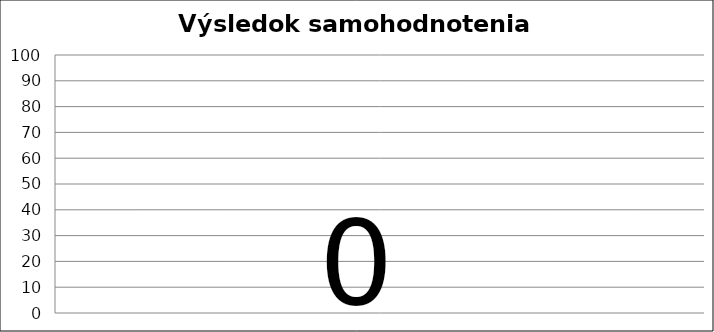
| Category | Percentuálne plnenie požiadaviek |
|---|---|
| 0 | 0 |